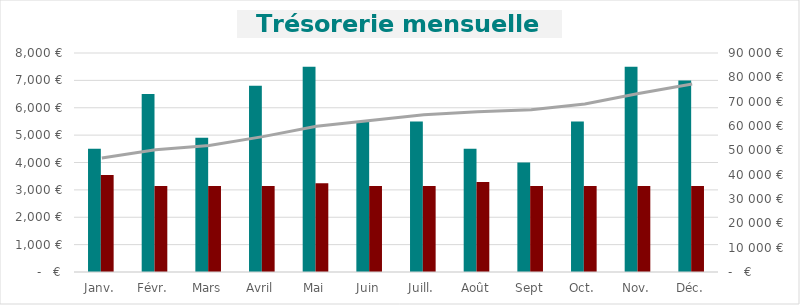
| Category | TOTAL ENCAISSEMENTS (1) | TOTAL DÉCAISSEMENTS (2) |
|---|---|---|
| Janv. | 4500 | 3541.36 |
| Févr. | 6500 | 3141.36 |
| Mars | 4900 | 3141.36 |
| Avril | 6800 | 3141.36 |
| Mai | 7500 | 3241.36 |
| Juin | 5500 | 3141.36 |
| Juill. | 5500 | 3141.36 |
| Août | 4500 | 3291.36 |
| Sept | 4000 | 3141.36 |
| Oct. | 5500 | 3141.36 |
| Nov. | 7500 | 3141.36 |
| Déc. | 7000 | 3141.36 |